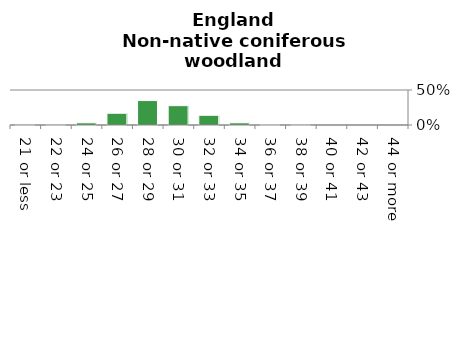
| Category | Non-native coniferous woodland |
|---|---|
| 21 or less | 0 |
| 22 or 23 | 0.001 |
| 24 or 25 | 0.031 |
| 26 or 27 | 0.168 |
| 28 or 29 | 0.349 |
| 30 or 31 | 0.276 |
| 32 or 33 | 0.139 |
| 34 or 35 | 0.031 |
| 36 or 37 | 0.004 |
| 38 or 39 | 0.001 |
| 40 or 41 | 0 |
| 42 or 43 | 0 |
| 44 or more | 0 |